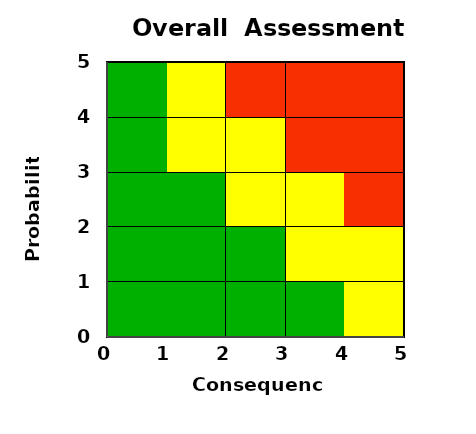
| Category | Series 1 |
|---|---|
| 2.4974358974358974 | 0 |